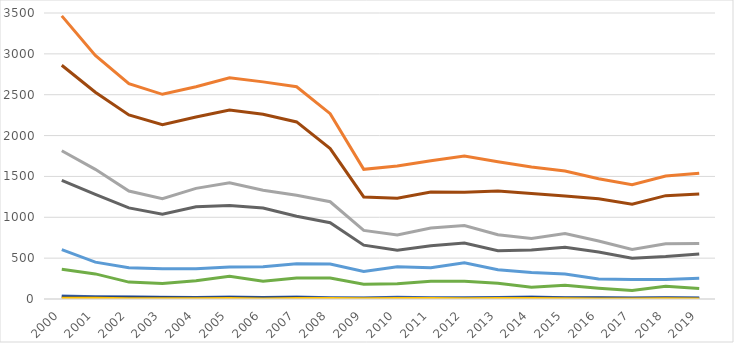
| Category | total NFDL | total NDL | sur NFDL | sur NDL | ug NFDL | ug NDL |
|---|---|---|---|---|---|---|
| 2000.0 | 3465 | 1815 | 2861 | 1452 | 604 | 363 |
| 2001.0 | 2981 | 1587 | 2530 | 1280 | 451 | 307 |
| 2002.0 | 2636 | 1322 | 2253 | 1115 | 383 | 207 |
| 2003.0 | 2505 | 1227 | 2134 | 1038 | 371 | 189 |
| 2004.0 | 2598 | 1354 | 2227 | 1130 | 371 | 224 |
| 2005.0 | 2706 | 1423 | 2314 | 1145 | 392 | 278 |
| 2006.0 | 2657 | 1330 | 2261 | 1113 | 396 | 217 |
| 2007.0 | 2598 | 1269 | 2167 | 1012 | 431 | 257 |
| 2008.0 | 2268 | 1190 | 1841 | 934 | 427 | 256 |
| 2009.0 | 1587 | 839 | 1249 | 659 | 338 | 180 |
| 2010.0 | 1628 | 783 | 1234 | 596 | 394 | 187 |
| 2011.0 | 1692 | 870 | 1309 | 652 | 383 | 218 |
| 2012.0 | 1750 | 900 | 1306 | 684 | 444 | 216 |
| 2013.0 | 1680 | 786 | 1323 | 592 | 357 | 194 |
| 2014.0 | 1615 | 742 | 1291 | 599 | 324 | 143 |
| 2015.0 | 1567 | 801 | 1261 | 632 | 306 | 169 |
| 2016.0 | 1472 | 709 | 1228 | 576 | 244 | 133 |
| 2017.0 | 1399 | 605 | 1159 | 500 | 240 | 105 |
| 2018.0 | 1505 | 675 | 1265 | 520 | 240 | 155 |
| 2019.0 | 1539 | 680 | 1285 | 552 | 254 | 128 |